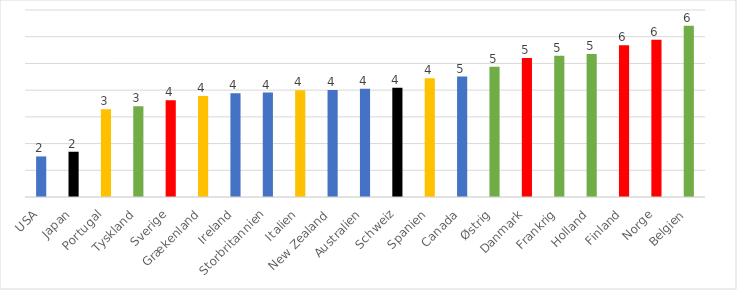
| Category | Series 0 |
|---|---|
| USA | 1.518 |
| Japan | 1.694 |
| Portugal | 3.285 |
| Tyskland | 3.393 |
| Sverige | 3.625 |
| Grækenland | 3.779 |
| Ireland | 3.887 |
| Storbritannien | 3.91 |
| Italien | 3.993 |
| New Zealand | 4.009 |
| Australien | 4.053 |
| Schweiz | 4.086 |
| Spanien | 4.445 |
| Canada | 4.509 |
| Østrig | 4.878 |
| Danmark | 5.207 |
| Frankrig | 5.286 |
| Holland | 5.351 |
| Finland | 5.682 |
| Norge | 5.888 |
| Belgien | 6.415 |